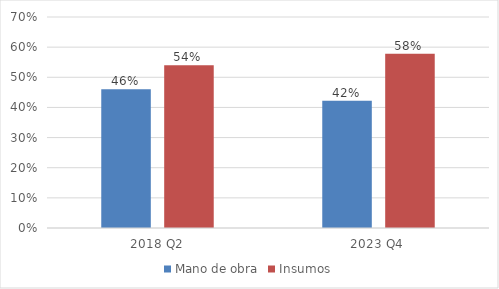
| Category | Mano de obra | Insumos |
|---|---|---|
| 2018 Q2 | 0.46 | 0.54 |
| 2023 Q4 | 0.422 | 0.578 |